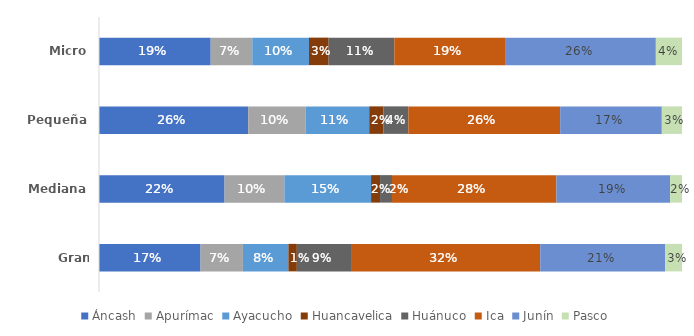
| Category | Áncash | Apurímac | Ayacucho | Huancavelica | Huánuco | Ica | Junín | Pasco |
|---|---|---|---|---|---|---|---|---|
| Gran Empresa | 0.174 | 0.073 | 0.078 | 0.015 | 0.094 | 0.323 | 0.214 | 0.029 |
| Mediana | 0.215 | 0.103 | 0.149 | 0.015 | 0.021 | 0.282 | 0.195 | 0.021 |
| Pequeña | 0.256 | 0.098 | 0.109 | 0.025 | 0.043 | 0.26 | 0.174 | 0.035 |
| Micro | 0.192 | 0.071 | 0.097 | 0.034 | 0.113 | 0.19 | 0.259 | 0.045 |